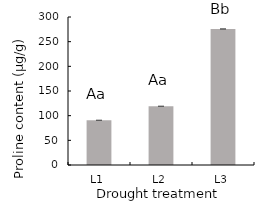
| Category | proline content  |
|---|---|
| L1 | 90.562 |
| L2 | 118.983 |
| L3 | 275.677 |